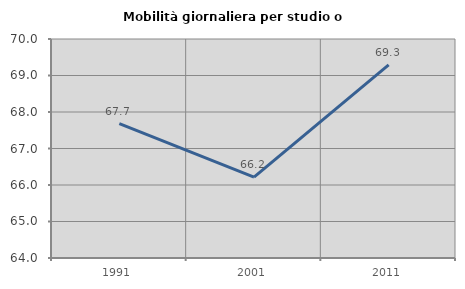
| Category | Mobilità giornaliera per studio o lavoro |
|---|---|
| 1991.0 | 67.68 |
| 2001.0 | 66.215 |
| 2011.0 | 69.291 |